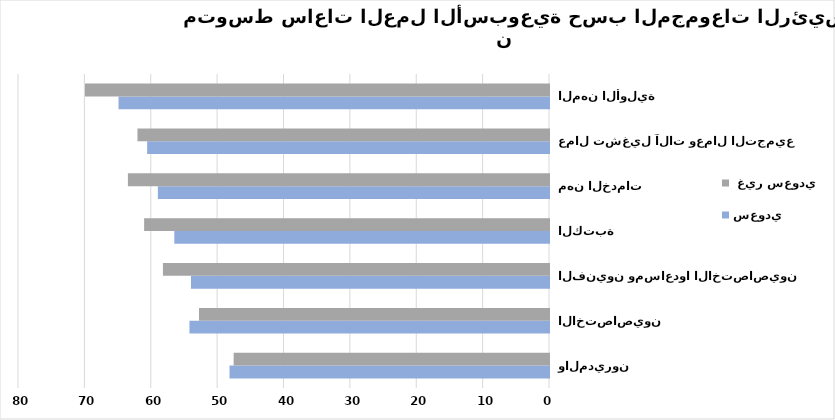
| Category | سعودي |  غير سعودي |
|---|---|---|
| المشرعون وكبار المسؤولين والمديرون | 48.132 | 47.511 |
| الاختصاصيون | 54.168 | 52.728 |
| الفنيون ومساعدوا الاختصاصيون | 53.941 | 58.165 |
| الكتبة | 56.451 | 60.998 |
| مهن الخدمات | 58.929 | 63.444 |
| عمال تشغيل آلات وعمال التجميع | 60.541 | 62 |
| المهن الأولية | 64.856 | 69.91 |